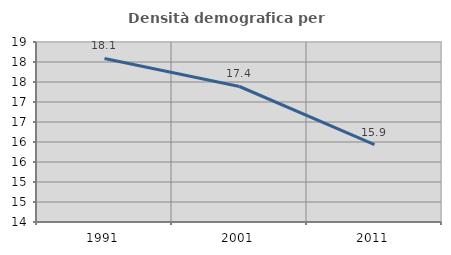
| Category | Densità demografica |
|---|---|
| 1991.0 | 18.088 |
| 2001.0 | 17.388 |
| 2011.0 | 15.936 |